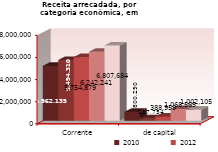
| Category | 2010 | 2011 | 2012 | 2013 | 2014 |
|---|---|---|---|---|---|
| Corrente | 4962135 | 5494310 | 5754879 | 6242241 | 6807684 |
| de capital | 800290 | 217754 | 388959 | 1068565 | 1002105 |